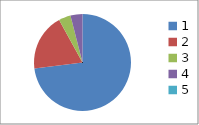
| Category | Series 0 |
|---|---|
| 0 | 0.73 |
| 1 | 0.19 |
| 2 | 0.04 |
| 3 | 0.04 |
| 4 | 0 |